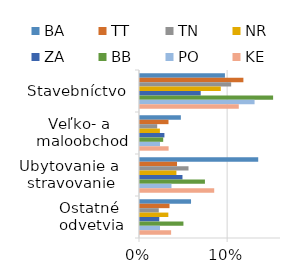
| Category | BA | TT | TN | NR | ZA | BB | PO | KE |
|---|---|---|---|---|---|---|---|---|
| Stavebníctvo | 0.096 | 0.117 | 0.103 | 0.092 | 0.069 | 0.151 | 0.13 | 0.112 |
| Veľko- a 
maloobchod | 0.046 | 0.032 | 0.02 | 0.023 | 0.028 | 0.026 | 0.023 | 0.032 |
| Ubytovanie a 
stravovanie | 0.134 | 0.042 | 0.055 | 0.041 | 0.048 | 0.074 | 0.036 | 0.084 |
| Ostatné 
odvetvia | 0.058 | 0.033 | 0.021 | 0.032 | 0.022 | 0.049 | 0.023 | 0.035 |